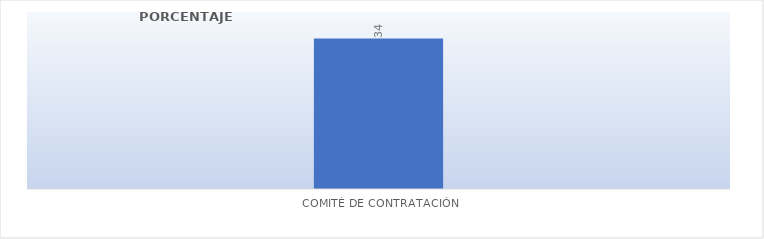
| Category | - |
|---|---|
| Comité de contratación | 34 |